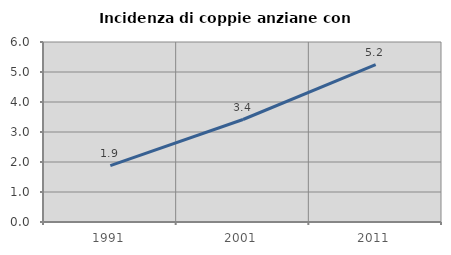
| Category | Incidenza di coppie anziane con figli |
|---|---|
| 1991.0 | 1.88 |
| 2001.0 | 3.416 |
| 2011.0 | 5.243 |